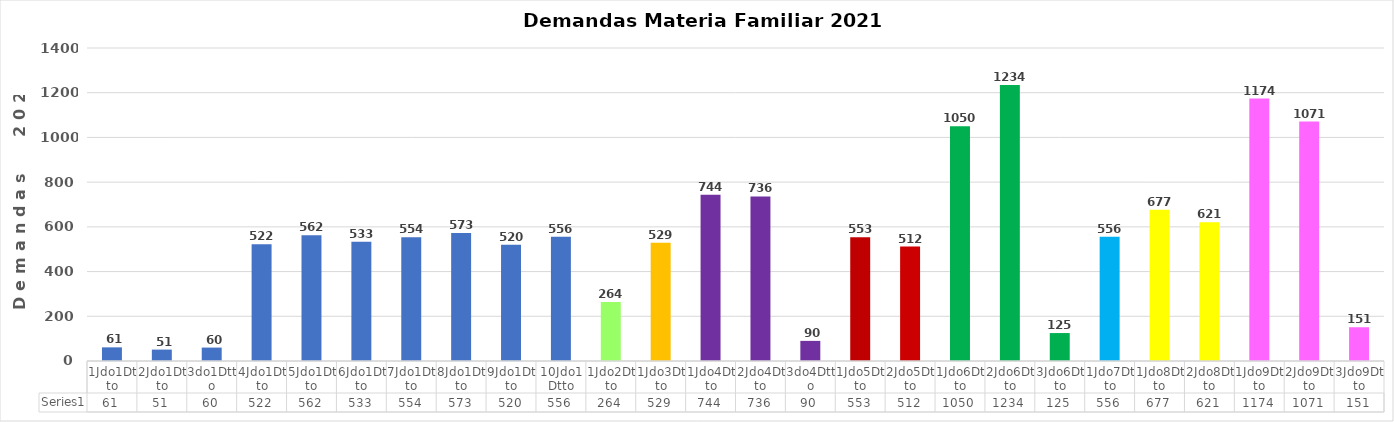
| Category | Series 0 |
|---|---|
| 1Jdo1Dtto | 61 |
| 2Jdo1Dtto | 51 |
| 3do1Dtto | 60 |
| 4Jdo1Dtto | 522 |
| 5Jdo1Dtto | 562 |
| 6Jdo1Dtto | 533 |
| 7Jdo1Dtto | 554 |
| 8Jdo1Dtto | 573 |
| 9Jdo1Dtto | 520 |
| 10Jdo1Dtto | 556 |
| 1Jdo2Dtto | 264 |
| 1Jdo3Dtto | 529 |
| 1Jdo4Dtto | 744 |
| 2Jdo4Dtto | 736 |
| 3do4Dtto | 90 |
| 1Jdo5Dtto | 553 |
| 2Jdo5Dtto | 512 |
| 1Jdo6Dtto | 1050 |
| 2Jdo6Dtto | 1234 |
| 3Jdo6Dtto | 125 |
| 1Jdo7Dtto | 556 |
| 1Jdo8Dtto | 677 |
| 2Jdo8Dtto | 621 |
| 1Jdo9Dtto | 1174 |
| 2Jdo9Dtto | 1071 |
| 3Jdo9Dtto | 151 |